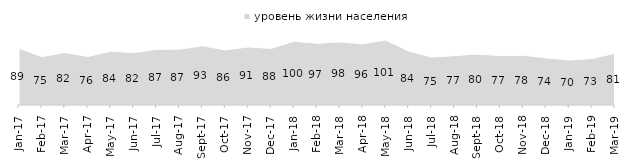
| Category | уровень жизни населения |
|---|---|
| 2017-01-01 | 88.55 |
| 2017-02-01 | 75.45 |
| 2017-03-01 | 82.1 |
| 2017-04-01 | 75.7 |
| 2017-05-01 | 83.85 |
| 2017-06-01 | 81.75 |
| 2017-07-01 | 86.95 |
| 2017-08-01 | 87.25 |
| 2017-09-01 | 92.5 |
| 2017-10-01 | 85.9 |
| 2017-11-01 | 90.75 |
| 2017-12-01 | 88.4 |
| 2018-01-01 | 99.6 |
| 2018-02-01 | 96.5 |
| 2018-03-01 | 98.45 |
| 2018-04-01 | 95.55 |
| 2018-05-01 | 101.45 |
| 2018-06-01 | 84.2 |
| 2018-07-01 | 74.9 |
| 2018-08-01 | 77.1 |
| 2018-09-01 | 79.6 |
| 2018-10-01 | 77.1 |
| 2018-11-01 | 77.745 |
| 2018-12-01 | 73.6 |
| 2019-01-01 | 70.25 |
| 2019-02-01 | 72.55 |
| 2019-03-01 | 80.806 |